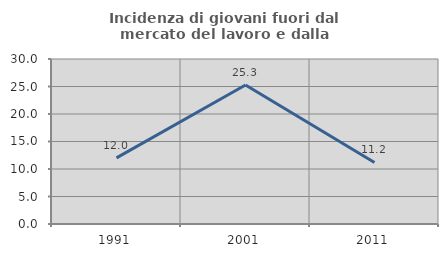
| Category | Incidenza di giovani fuori dal mercato del lavoro e dalla formazione  |
|---|---|
| 1991.0 | 12.014 |
| 2001.0 | 25.277 |
| 2011.0 | 11.196 |